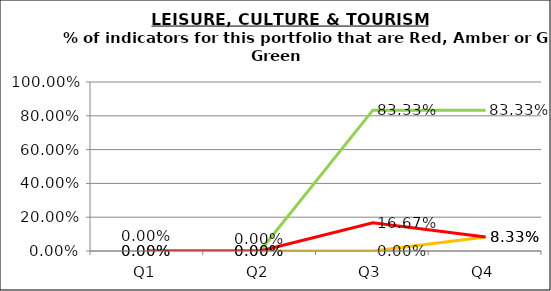
| Category | Green | Amber | Red |
|---|---|---|---|
| Q1 | 0 | 0 | 0 |
| Q2 | 0 | 0 | 0 |
| Q3 | 0.833 | 0 | 0.167 |
| Q4 | 0.833 | 0.083 | 0.083 |